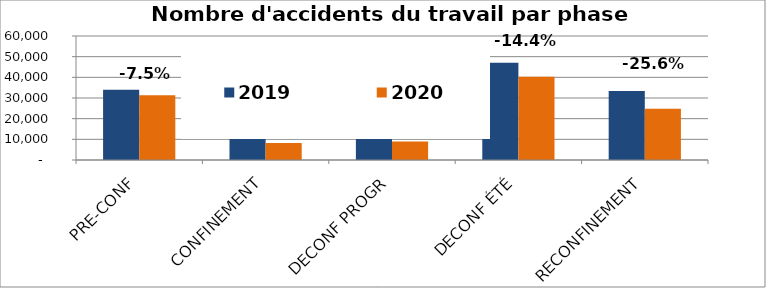
| Category | 2019 | 2020 |
|---|---|---|
| PRE-CONF | 33951 | 31391 |
| CONFINEMENT | 18748 | 8193 |
| DECONF PROGR | 13610 | 8950 |
| DECONF ÉTÉ | 47062 | 40306 |
| RECONFINEMENT | 33410 | 24858 |